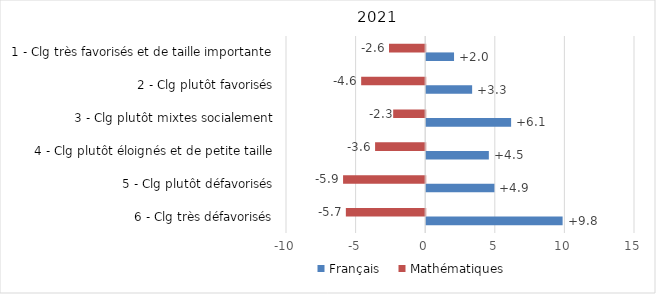
| Category | Français | Mathématiques |
|---|---|---|
| 6 - Clg très défavorisés | 9.8 | -5.7 |
| 5 - Clg plutôt défavorisés | 4.9 | -5.9 |
| 4 - Clg plutôt éloignés et de petite taille | 4.5 | -3.6 |
| 3 - Clg plutôt mixtes socialement | 6.1 | -2.3 |
| 2 - Clg plutôt favorisés | 3.3 | -4.6 |
| 1 - Clg très favorisés et de taille importante | 2 | -2.6 |